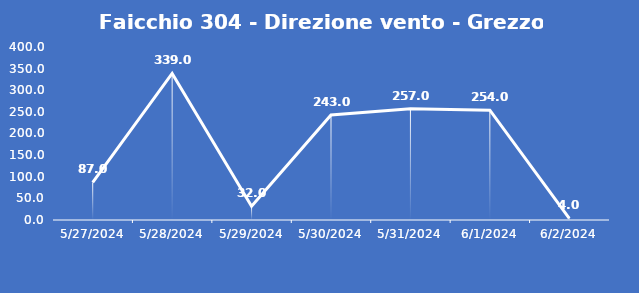
| Category | Faicchio 304 - Direzione vento - Grezzo (°N) |
|---|---|
| 5/27/24 | 87 |
| 5/28/24 | 339 |
| 5/29/24 | 32 |
| 5/30/24 | 243 |
| 5/31/24 | 257 |
| 6/1/24 | 254 |
| 6/2/24 | 4 |